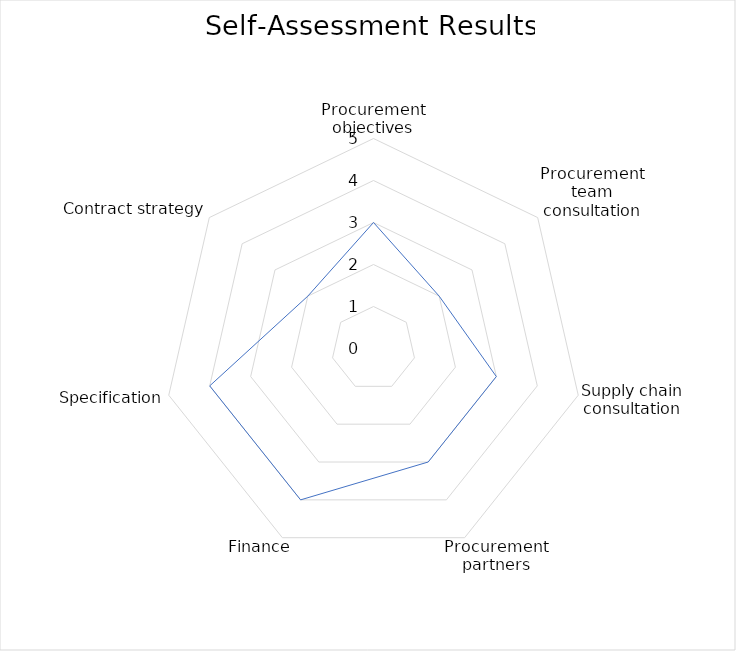
| Category | Series 0 |
|---|---|
| Procurement objectives | 3 |
| Procurement team consultation | 2 |
| Supply chain consultation | 3 |
| Procurement partners | 3 |
| Finance | 4 |
| Specification | 4 |
| Contract strategy  | 2 |